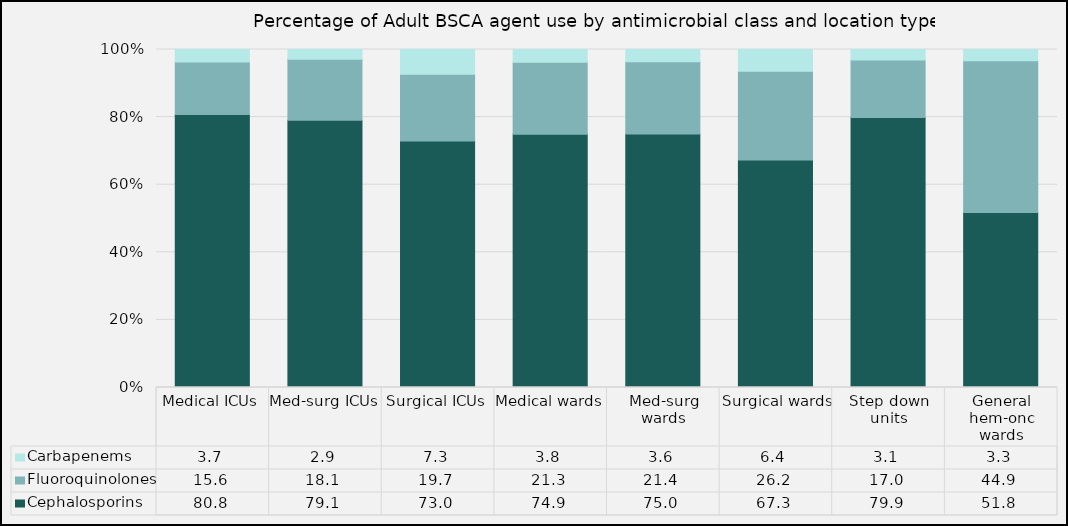
| Category | Cephalosporins | Fluoroquinolones | Carbapenems |
|---|---|---|---|
| Medical ICUs | 80.76 | 15.57 | 3.67 |
| Med-surg ICUs | 79.07 | 18.05 | 2.88 |
| Surgical ICUs | 72.96 | 19.71 | 7.33 |
| Medical wards | 74.91 | 21.33 | 3.75 |
| Med-surg wards | 75 | 21.41 | 3.59 |
| Surgical wards | 67.33 | 26.23 | 6.44 |
| Step down units | 79.86 | 17.01 | 3.14 |
| General hem-onc wards | 51.76 | 44.91 | 3.33 |